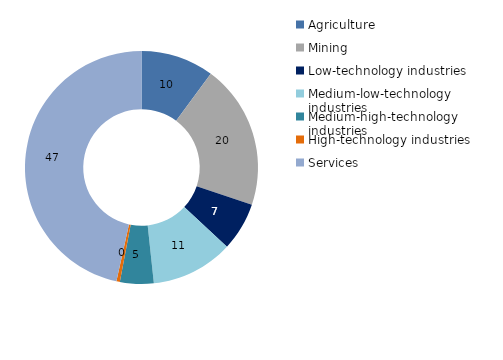
| Category | 2014 |
|---|---|
| Agriculture | 10.137 |
| Mining | 20.055 |
| Low-technology industries | 6.706 |
| Medium-low-technology industries | 11.411 |
| Medium-high-technology industries | 4.675 |
| High-technology industries | 0.473 |
| Services | 46.544 |